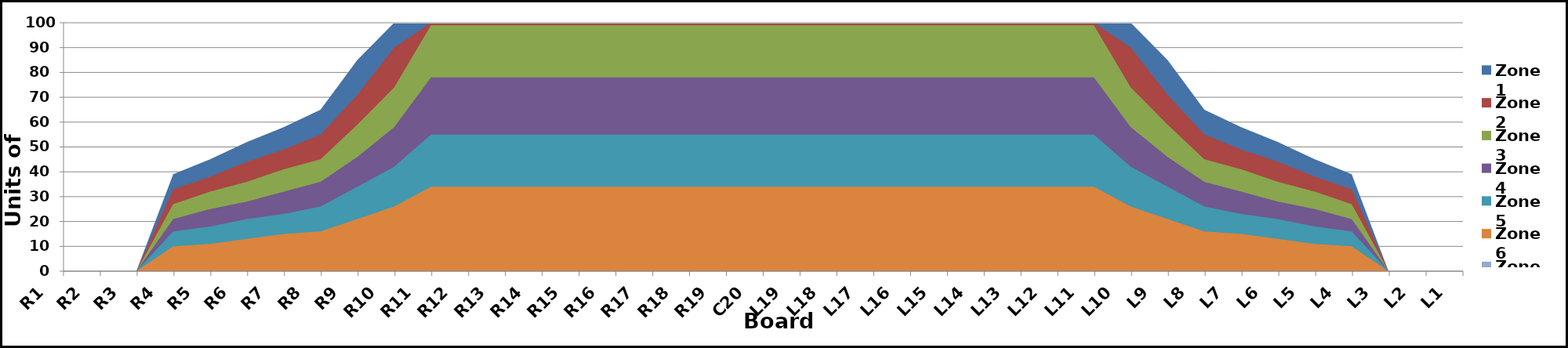
| Category | Zone 1 | Zone 2 | Zone 3 | Zone 4 | Zone 5 | Zone 6 | Zone 7 | Zone 8 |
|---|---|---|---|---|---|---|---|---|
| L1 | 0 | 0 | 0 | 0 | 0 | 0 | 0 | 0 |
| L2 | 0 | 0 | 0 | 0 | 0 | 0 | 0 | 0 |
| L3 | 0 | 0 | 0 | 0 | 0 | 0 | 0 | 0 |
| L4 | 39 | 33 | 27 | 21 | 16 | 10 | 0 | 0 |
| L5 | 45 | 38 | 32 | 25 | 18 | 11 | 0 | 0 |
| L6 | 52 | 44 | 36 | 28 | 21 | 13 | 0 | 0 |
| L7 | 58 | 49 | 41 | 32 | 23 | 15 | 0 | 0 |
| L8 | 65 | 55 | 45 | 36 | 26 | 16 | 0 | 0 |
| L9 | 85 | 71 | 59 | 46 | 34 | 21 | 0 | 0 |
| L10 | 100 | 90 | 74 | 58 | 42 | 26 | 0 | 0 |
| L11 | 100 | 100 | 99 | 78 | 55 | 34 | 0 | 0 |
| L12 | 100 | 100 | 99 | 78 | 55 | 34 | 0 | 0 |
| L13 | 100 | 100 | 99 | 78 | 55 | 34 | 0 | 0 |
| L14 | 100 | 100 | 99 | 78 | 55 | 34 | 0 | 0 |
| L15 | 100 | 100 | 99 | 78 | 55 | 34 | 0 | 0 |
| L16 | 100 | 100 | 99 | 78 | 55 | 34 | 0 | 0 |
| L17 | 100 | 100 | 99 | 78 | 55 | 34 | 0 | 0 |
| L18 | 100 | 100 | 99 | 78 | 55 | 34 | 0 | 0 |
| L19 | 100 | 100 | 99 | 78 | 55 | 34 | 0 | 0 |
| C20 | 100 | 100 | 99 | 78 | 55 | 34 | 0 | 0 |
| R19 | 100 | 100 | 99 | 78 | 55 | 34 | 0 | 0 |
| R18 | 100 | 100 | 99 | 78 | 55 | 34 | 0 | 0 |
| R17 | 100 | 100 | 99 | 78 | 55 | 34 | 0 | 0 |
| R16 | 100 | 100 | 99 | 78 | 55 | 34 | 0 | 0 |
| R15 | 100 | 100 | 99 | 78 | 55 | 34 | 0 | 0 |
| R14 | 100 | 100 | 99 | 78 | 55 | 34 | 0 | 0 |
| R13 | 100 | 100 | 99 | 78 | 55 | 34 | 0 | 0 |
| R12 | 100 | 100 | 99 | 78 | 55 | 34 | 0 | 0 |
| R11 | 100 | 100 | 99 | 78 | 55 | 34 | 0 | 0 |
| R10 | 100 | 90 | 74 | 58 | 42 | 26 | 0 | 0 |
| R9 | 85 | 71 | 59 | 46 | 34 | 21 | 0 | 0 |
| R8 | 65 | 55 | 45 | 36 | 26 | 16 | 0 | 0 |
| R7 | 58 | 49 | 41 | 32 | 23 | 15 | 0 | 0 |
| R6 | 52 | 44 | 36 | 28 | 21 | 13 | 0 | 0 |
| R5 | 45 | 38 | 32 | 25 | 18 | 11 | 0 | 0 |
| R4 | 39 | 33 | 27 | 21 | 16 | 10 | 0 | 0 |
| R3 | 0 | 0 | 0 | 0 | 0 | 0 | 0 | 0 |
| R2 | 0 | 0 | 0 | 0 | 0 | 0 | 0 | 0 |
| R1 | 0 | 0 | 0 | 0 | 0 | 0 | 0 | 0 |